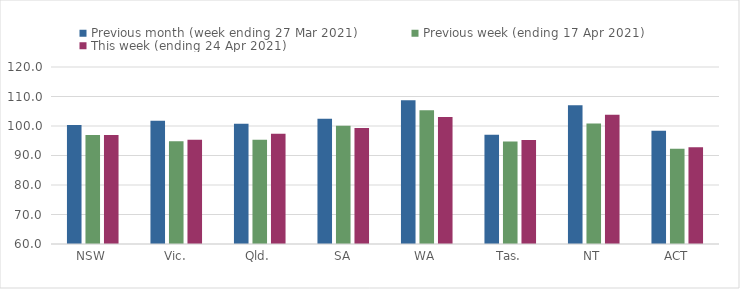
| Category | Previous month (week ending 27 Mar 2021) | Previous week (ending 17 Apr 2021) | This week (ending 24 Apr 2021) |
|---|---|---|---|
| NSW | 100.33 | 96.92 | 96.94 |
| Vic. | 101.74 | 94.79 | 95.34 |
| Qld. | 100.79 | 95.3 | 97.35 |
| SA | 102.46 | 100.08 | 99.36 |
| WA | 108.72 | 105.31 | 103.07 |
| Tas. | 97.06 | 94.75 | 95.29 |
| NT | 107.06 | 100.81 | 103.85 |
| ACT | 98.35 | 92.28 | 92.83 |